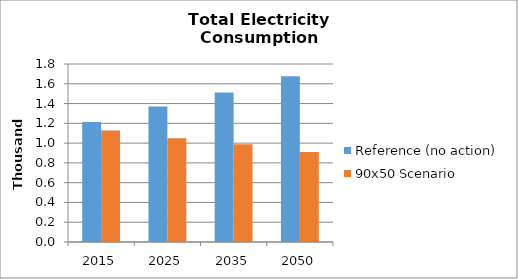
| Category | Reference (no action) | 90x50 Scenario |
|---|---|---|
| 2015.0 | 1.214 | 1.128 |
| 2025.0 | 1.371 | 1.05 |
| 2035.0 | 1.512 | 0.987 |
| 2050.0 | 1.677 | 0.909 |